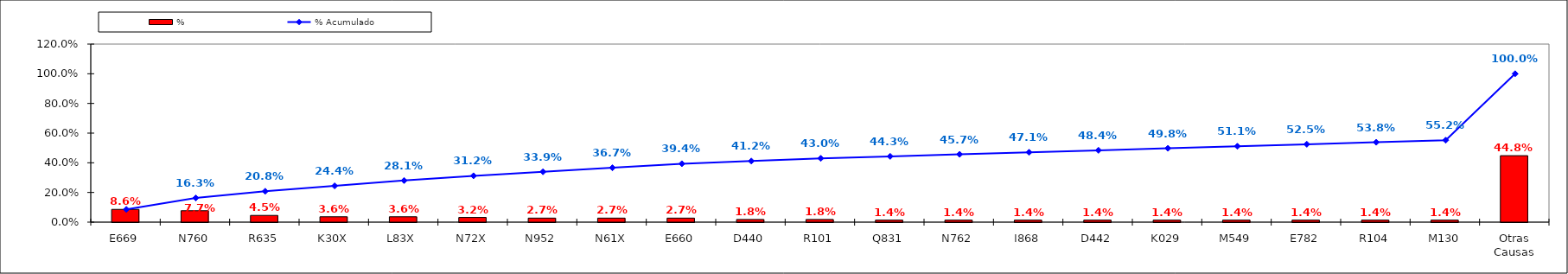
| Category | % |
|---|---|
| E669 | 0.086 |
| N760 | 0.077 |
| R635 | 0.045 |
| K30X | 0.036 |
| L83X | 0.036 |
| N72X | 0.032 |
| N952 | 0.027 |
| N61X | 0.027 |
| E660 | 0.027 |
| D440 | 0.018 |
| R101 | 0.018 |
| Q831 | 0.014 |
| N762 | 0.014 |
| I868 | 0.014 |
| D442 | 0.014 |
| K029 | 0.014 |
| M549 | 0.014 |
| E782 | 0.014 |
| R104 | 0.014 |
| M130 | 0.014 |
| Otras Causas | 0.448 |